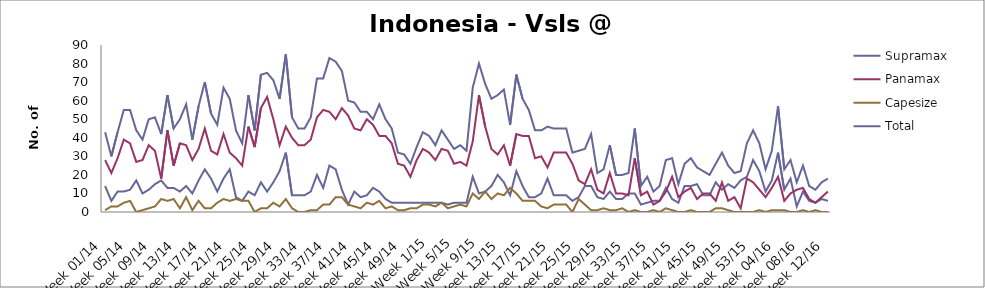
| Category | Supramax | Panamax | Capesize | Total |
|---|---|---|---|---|
| Week 01/14 | 14 | 28 | 1 | 43 |
| Week 02/14 | 6 | 21 | 3 | 30 |
| Week 03/14 | 11 | 29 | 3 | 43 |
| Week 04/14 | 11 | 39 | 5 | 55 |
| Week 05/14 | 12 | 37 | 6 | 55 |
| Week 06/14 | 17 | 27 | 0 | 44 |
| Week 07/14 | 10 | 28 | 1 | 39 |
| Week 08/14 | 12 | 36 | 2 | 50 |
| Week 09/14 | 15 | 33 | 3 | 51 |
| Week 10/14 | 17 | 18 | 7 | 42 |
| Week 11/14 | 13 | 44 | 6 | 63 |
| Week 12/14 | 13 | 25 | 7 | 45 |
| Week 13/14 | 11 | 37 | 2 | 50 |
| Week 14/14 | 14 | 36 | 8 | 58 |
| Week 15/14 | 10 | 28 | 1 | 39 |
| Week 16/14 | 17 | 34 | 6 | 57 |
| Week 17/14 | 23 | 45 | 2 | 70 |
| Week 18/14 | 18 | 33 | 2 | 53 |
| Week 19/14 | 11 | 31 | 5 | 47 |
| Week 20/14 | 18 | 42 | 7 | 67 |
| Week 21/14 | 23 | 32 | 6 | 61 |
| Week 22/14 | 8 | 29 | 7 | 44 |
| Week 23/14 | 6 | 25 | 6 | 37 |
| Week 24/14 | 11 | 46 | 6 | 63 |
| Week 25/14 | 9 | 35 | 0 | 44 |
| Week 26/14 | 16 | 56 | 2 | 74 |
| Week 27/14 | 11 | 62 | 2 | 75 |
| Week 28/14 | 16 | 50 | 5 | 71 |
| Week 29/14 | 22 | 36 | 3 | 61 |
| Week 30/14 | 32 | 46 | 7 | 85 |
| Week 31/14 | 9 | 40 | 2 | 51 |
| Week 32/14 | 9 | 36 | 0 | 45 |
| Week 33/14 | 9 | 36 | 0 | 45 |
| Week 34/14 | 11 | 39 | 1 | 51 |
| Week 35/14 | 20 | 51 | 1 | 72 |
| Week 36/14 | 13 | 55 | 4 | 72 |
| Week 37/14 | 25 | 54 | 4 | 83 |
| Week 38/14 | 23 | 50 | 8 | 81 |
| Week 39/14 | 12 | 56 | 8 | 76 |
| Week 40/14 | 4 | 52 | 4 | 60 |
| Week 41/14 | 11 | 45 | 3 | 59 |
| Week 42/14 | 8 | 44 | 2 | 54 |
| Week 43/14 | 9 | 50 | 5 | 54 |
| Week 44/14 | 13 | 47 | 4 | 50 |
| Week 45/14 | 11 | 41 | 6 | 58 |
| Week 46/14 | 7 | 41 | 2 | 50 |
| Week 47/14 | 5 | 37 | 3 | 45 |
| Week 48/14 | 5 | 26 | 1 | 32 |
| Week 49/14 | 5 | 25 | 1 | 31 |
| Week 50/14 | 5 | 19 | 2 | 26 |
| Week 51/14 | 5 | 28 | 2 | 35 |
| Week 52/14 | 5 | 34 | 4 | 43 |
| Week 1/15 | 5 | 32 | 4 | 41 |
| Week 2/15 | 5 | 28 | 3 | 36 |
| Week 3/15 | 5 | 34 | 5 | 44 |
| Week 4/15 | 4 | 33 | 2 | 39 |
| Week 5/15 | 5 | 26 | 3 | 34 |
| Week 6/15 | 5 | 27 | 4 | 36 |
| Week 7/15 | 5 | 25 | 3 | 33 |
| Week 8/15 | 19 | 38 | 10 | 67 |
| Week 9/15 | 10 | 63 | 7 | 80 |
| Week 10/15 | 11 | 46 | 11 | 69 |
| Week 11/15 | 14 | 34 | 7 | 61 |
| Week 12/15 | 20 | 31 | 10 | 63 |
| Week 13/15 | 16 | 36 | 9 | 66 |
| Week 14/15 | 9 | 25 | 13 | 47 |
| Week 15/15 | 22 | 42 | 10 | 74 |
| Week 16/15 | 14 | 41 | 6 | 61 |
| Week 17/15 | 8 | 41 | 6 | 55 |
| Week 18/15 | 8 | 29 | 6 | 44 |
| Week 19/15 | 10 | 30 | 3 | 44 |
| Week 20/15 | 18 | 24 | 2 | 46 |
| Week 21/15 | 9 | 32 | 4 | 45 |
| Week 22/15 | 9 | 32 | 4 | 45 |
| Week 23/15 | 9 | 32 | 4 | 45 |
| Week 24/15 | 6 | 26 | 0 | 32 |
| Week 25/15 | 8 | 17 | 7 | 33 |
| Week 26/15 | 14 | 15 | 4 | 34 |
| Week 27/15 | 14 | 23 | 1 | 42 |
| Week 28/15 | 8 | 12 | 1 | 21 |
| Week 29/15 | 7 | 10 | 2 | 23 |
| Week 30/15 | 11 | 21 | 1 | 36 |
| Week 31/15 | 7 | 10 | 1 | 20 |
| Week 32/15 | 7 | 10 | 2 | 20 |
| Week 33/15 | 10 | 9 | 0 | 21 |
| Week 34/15 | 10 | 29 | 1 | 45 |
| Week 35/15 | 4 | 9 | 0 | 14 |
| Week 36/15 | 5 | 11 | 0 | 19 |
| Week 37/15 | 6 | 4 | 1 | 11 |
| Week 38/15 | 6 | 6 | 0 | 14 |
| Week 39/15 | 13 | 11 | 2 | 28 |
| Week 40/15 | 7 | 19 | 1 | 29 |
| Week 41/15 | 5 | 8 | 0 | 15 |
| Week 42/15 | 14 | 11 | 0 | 26 |
| Week 43/15 | 14 | 13 | 1 | 29 |
| Week 44/15 | 15 | 7 | 0 | 24 |
| Week 45/15 | 9 | 10 | 0 | 22 |
| Week 46/15 | 9 | 10 | 0 | 20 |
| Week 47/15 | 16 | 6 | 2 | 26 |
| Week 48/15 | 12 | 16 | 2 | 32 |
| Week 49/15 | 15 | 6 | 1 | 25 |
| Week 50/15 | 13 | 8 | 0 | 21 |
| Week 51/15 | 17 | 2 | 0 | 22 |
| Week 52/15 | 19 | 18 | 0 | 37 |
| Week 53/15 | 28 | 16 | 0 | 44 |
| Week 01/16 | 22 | 12 | 1 | 37 |
| Week 02/16 | 11 | 8 | 0 | 23 |
| Week 03/16 | 17 | 13 | 1 | 33 |
| Week 04/16 | 32 | 19 | 1 | 57 |
| Week 05/16 | 12 | 6 | 1 | 23 |
| Week 06/16 | 18 | 10 | 0 | 28 |
| Week 07/16 | 3 | 12 | 0 | 16 |
| Week 08/16 | 11 | 13 | 1 | 25 |
| Week 09/16 | 6 | 7 | 0 | 14 |
| Week 10/16 | 5 | 5 | 1 | 12 |
| Week 11/16 | 7 | 8 | 0 | 16 |
| Week 12/16 | 6 | 11 | 0 | 18 |